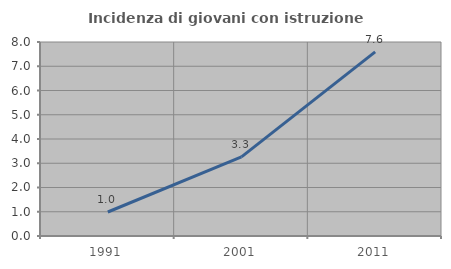
| Category | Incidenza di giovani con istruzione universitaria |
|---|---|
| 1991.0 | 0.99 |
| 2001.0 | 3.261 |
| 2011.0 | 7.595 |